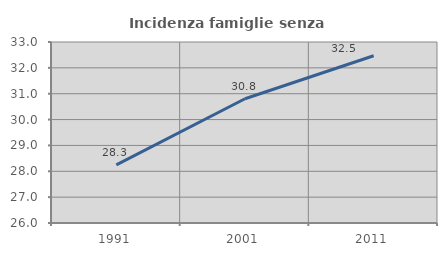
| Category | Incidenza famiglie senza nuclei |
|---|---|
| 1991.0 | 28.25 |
| 2001.0 | 30.806 |
| 2011.0 | 32.468 |